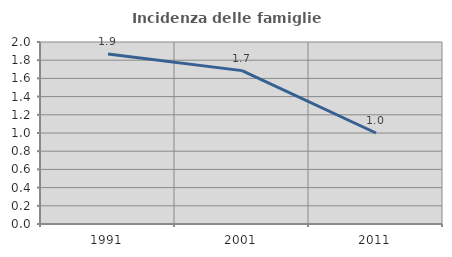
| Category | Incidenza delle famiglie numerose |
|---|---|
| 1991.0 | 1.868 |
| 2001.0 | 1.685 |
| 2011.0 | 1 |